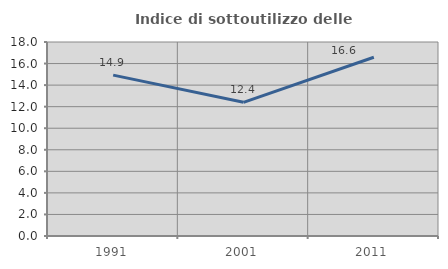
| Category | Indice di sottoutilizzo delle abitazioni  |
|---|---|
| 1991.0 | 14.928 |
| 2001.0 | 12.402 |
| 2011.0 | 16.588 |